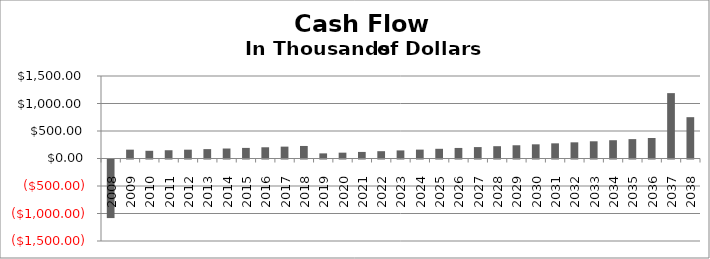
| Category | Cash Flow |
|---|---|
| 2008.0 | -1065 |
| 2009.0 | 160.78 |
| 2010.0 | 140.35 |
| 2011.0 | 150.2 |
| 2012.0 | 160.35 |
| 2013.0 | 170.8 |
| 2014.0 | 181.57 |
| 2015.0 | 192.66 |
| 2016.0 | 204.08 |
| 2017.0 | 215.84 |
| 2018.0 | 227.96 |
| 2019.0 | 93.27 |
| 2020.0 | 106.13 |
| 2021.0 | 119.37 |
| 2022.0 | 133.01 |
| 2023.0 | 147.06 |
| 2024.0 | 161.53 |
| 2025.0 | 176.43 |
| 2026.0 | 191.78 |
| 2027.0 | 207.59 |
| 2028.0 | 223.87 |
| 2029.0 | 240.65 |
| 2030.0 | 257.92 |
| 2031.0 | 275.72 |
| 2032.0 | 294.05 |
| 2033.0 | 312.93 |
| 2034.0 | 332.37 |
| 2035.0 | 352.4 |
| 2036.0 | 373.03 |
| 2037.0 | 1188.52 |
| 2038.0 | 751.4 |